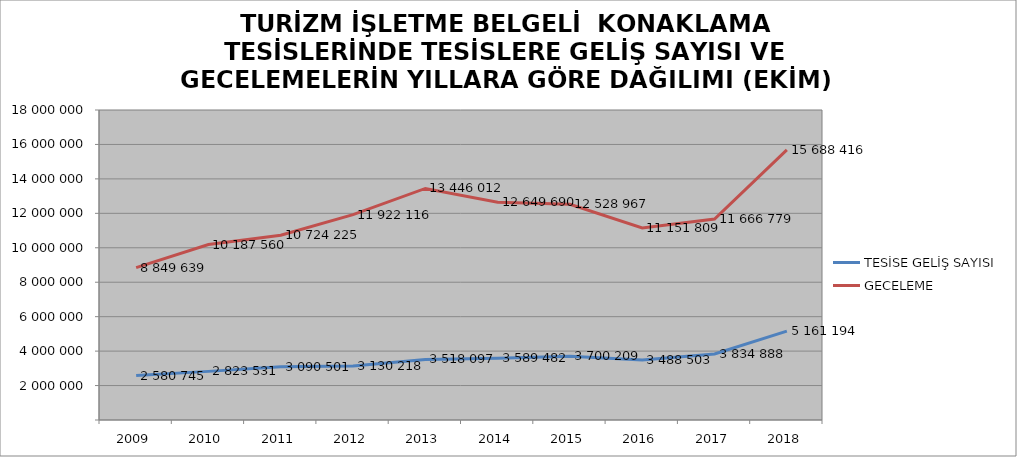
| Category | TESİSE GELİŞ SAYISI | GECELEME |
|---|---|---|
| 2009 | 2580745 | 8849639 |
| 2010 | 2823531 | 10187560 |
| 2011 | 3090501 | 10724225 |
| 2012 | 3130218 | 11922116 |
| 2013 | 3518097 | 13446012 |
| 2014 | 3589482 | 12649690 |
| 2015 | 3700209 | 12528967 |
| 2016 | 3488503 | 11151809 |
| 2017 | 3834888 | 11666779 |
| 2018 | 5161194 | 15688416 |